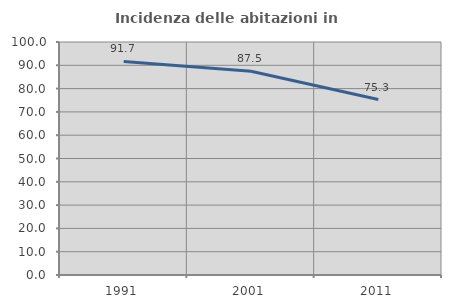
| Category | Incidenza delle abitazioni in proprietà  |
|---|---|
| 1991.0 | 91.672 |
| 2001.0 | 87.452 |
| 2011.0 | 75.314 |